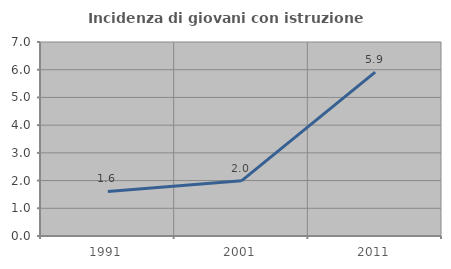
| Category | Incidenza di giovani con istruzione universitaria |
|---|---|
| 1991.0 | 1.609 |
| 2001.0 | 1.991 |
| 2011.0 | 5.914 |